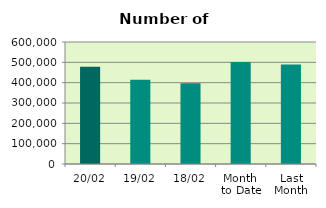
| Category | Series 0 |
|---|---|
| 20/02 | 478796 |
| 19/02 | 414256 |
| 18/02 | 397294 |
| Month 
to Date | 501895.571 |
| Last
Month | 488780.727 |